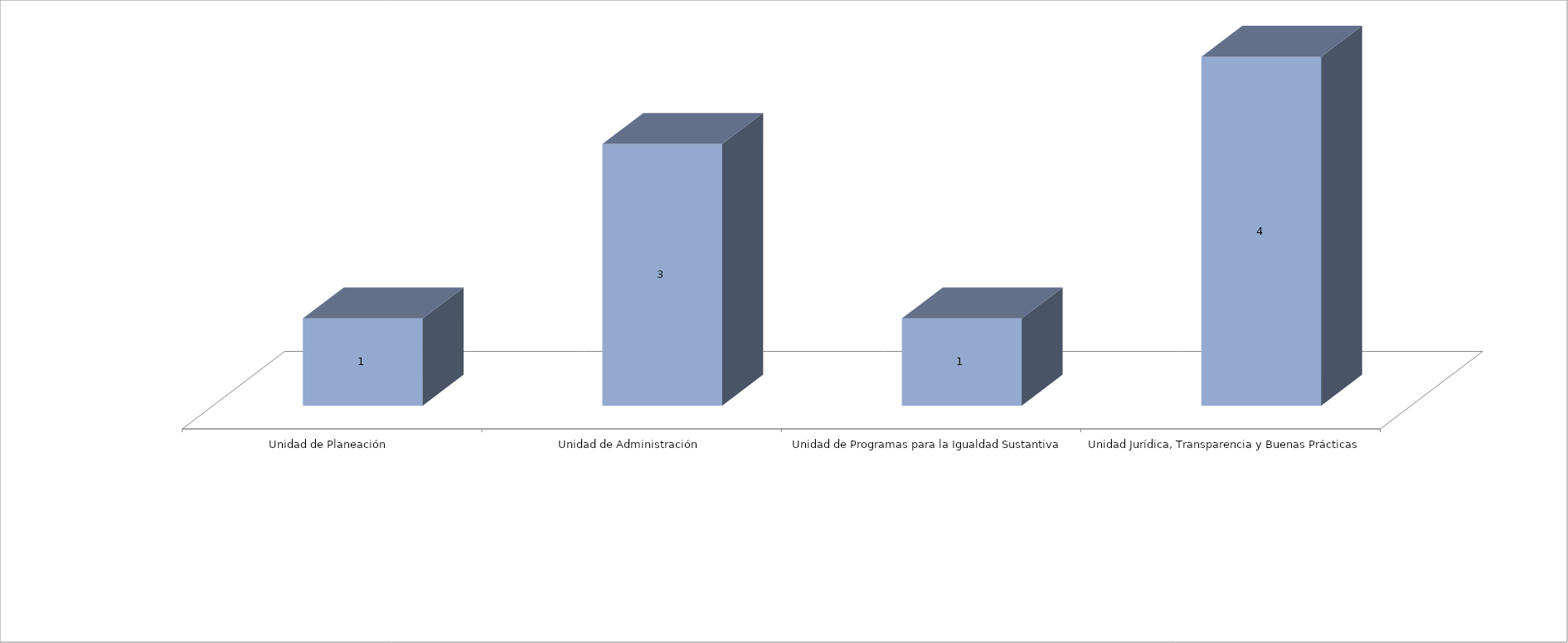
| Category | Series 0 | Series 1 |
|---|---|---|
| Unidad de Planeación  |  | 1 |
| Unidad de Administración |  | 3 |
| Unidad de Programas para la Igualdad Sustantiva |  | 1 |
| Unidad Jurídica, Transparencia y Buenas Prácticas  |  | 4 |